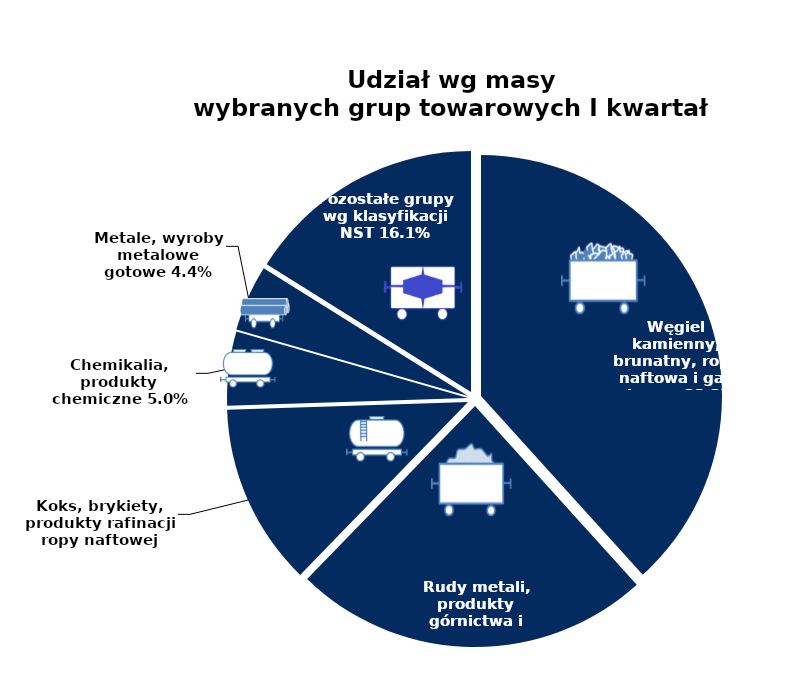
| Category | Series 0 |
|---|---|
| Węgiel kamienny, brunatny, ropa naftowa i gaz ziemny | 0.383 |
| Rudy metali, produkty górnictwa i kopalnictwa | 0.24 |
| Koks, brykiety, produkty rafinacji ropy naftowej | 0.122 |
| Chemikalia, produkty chemiczne | 0.05 |
| Metale, wyroby metalowe gotowe | 0.044 |
| Pozostałe grupy wg klasyfikacji NST | 0.161 |